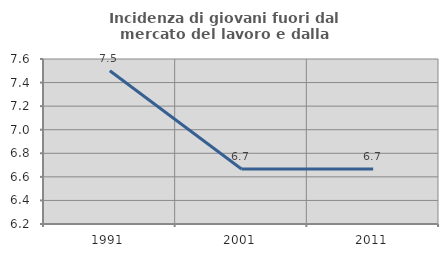
| Category | Incidenza di giovani fuori dal mercato del lavoro e dalla formazione  |
|---|---|
| 1991.0 | 7.5 |
| 2001.0 | 6.667 |
| 2011.0 | 6.667 |